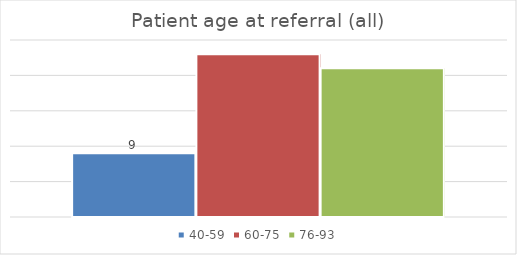
| Category | 40-59 | 60-75 | 76-93 |
|---|---|---|---|
| 0 | 9 | 23 | 21 |